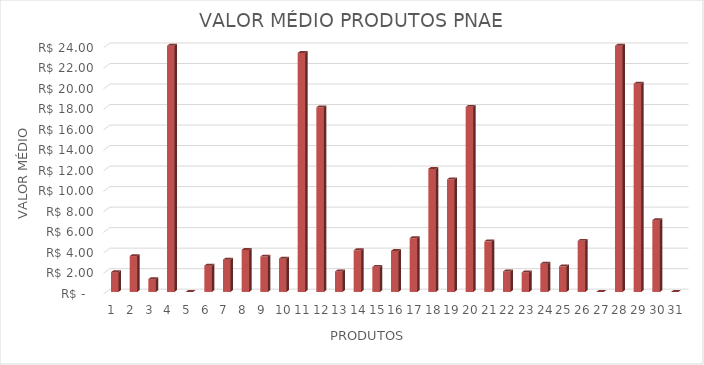
| Category | Series 0 |
|---|---|
| 0 | 1.933 |
| 1 | 3.5 |
| 2 | 1.25 |
| 3 | 25 |
| 4 | 0 |
| 5 | 2.567 |
| 6 | 3.15 |
| 7 | 4.1 |
| 8 | 3.45 |
| 9 | 3.25 |
| 10 | 23.3 |
| 11 | 18 |
| 12 | 2 |
| 13 | 4.067 |
| 14 | 2.45 |
| 15 | 4 |
| 16 | 5.25 |
| 17 | 12 |
| 18 | 10.975 |
| 19 | 18.05 |
| 20 | 4.933 |
| 21 | 2 |
| 22 | 1.9 |
| 23 | 2.75 |
| 24 | 2.5 |
| 25 | 4.983 |
| 26 | 0 |
| 27 | 45 |
| 28 | 20.3 |
| 29 | 7 |
| 30 | 0 |